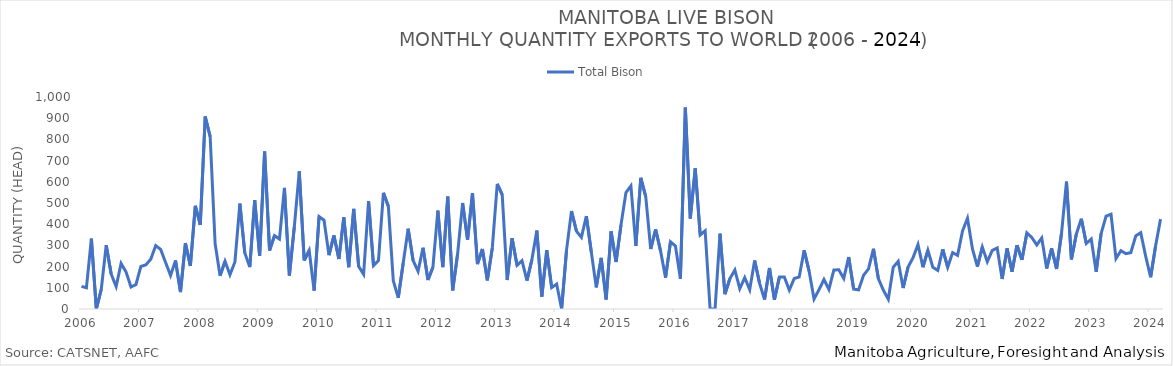
| Category | Total Bison |
|---|---|
| 2006-01-01 | 107 |
| 2006-02-01 | 100 |
| 2006-03-01 | 332 |
| 2006-04-01 | 0 |
| 2006-05-01 | 93 |
| 2006-06-01 | 301 |
| 2006-07-01 | 165 |
| 2006-08-01 | 106 |
| 2006-09-01 | 215 |
| 2006-10-01 | 175 |
| 2006-11-01 | 104 |
| 2006-12-01 | 115 |
| 2007-01-01 | 201 |
| 2007-02-01 | 208 |
| 2007-03-01 | 235 |
| 2007-04-01 | 299 |
| 2007-05-01 | 281 |
| 2007-06-01 | 219 |
| 2007-07-01 | 158 |
| 2007-08-01 | 229 |
| 2007-09-01 | 80 |
| 2007-10-01 | 311 |
| 2007-11-01 | 203 |
| 2007-12-01 | 487 |
| 2008-01-01 | 397 |
| 2008-02-01 | 908 |
| 2008-03-01 | 813 |
| 2008-04-01 | 308 |
| 2008-05-01 | 157 |
| 2008-06-01 | 225 |
| 2008-07-01 | 162 |
| 2008-08-01 | 222 |
| 2008-09-01 | 497 |
| 2008-10-01 | 264 |
| 2008-11-01 | 198 |
| 2008-12-01 | 513 |
| 2009-01-01 | 251 |
| 2009-02-01 | 743 |
| 2009-03-01 | 276 |
| 2009-04-01 | 346 |
| 2009-05-01 | 330 |
| 2009-06-01 | 571 |
| 2009-07-01 | 158 |
| 2009-08-01 | 387 |
| 2009-09-01 | 649 |
| 2009-10-01 | 229 |
| 2009-11-01 | 276 |
| 2009-12-01 | 87 |
| 2010-01-01 | 436 |
| 2010-02-01 | 419 |
| 2010-03-01 | 254 |
| 2010-04-01 | 347 |
| 2010-05-01 | 236 |
| 2010-06-01 | 432 |
| 2010-07-01 | 197 |
| 2010-08-01 | 472 |
| 2010-09-01 | 201 |
| 2010-10-01 | 164 |
| 2010-11-01 | 509 |
| 2010-12-01 | 205 |
| 2011-01-01 | 228 |
| 2011-02-01 | 548 |
| 2011-03-01 | 484 |
| 2011-04-01 | 133 |
| 2011-05-01 | 53 |
| 2011-06-01 | 217 |
| 2011-07-01 | 379 |
| 2011-08-01 | 229 |
| 2011-09-01 | 178 |
| 2011-10-01 | 289 |
| 2011-11-01 | 137 |
| 2011-12-01 | 197 |
| 2012-01-01 | 464 |
| 2012-02-01 | 198 |
| 2012-03-01 | 530 |
| 2012-04-01 | 88 |
| 2012-05-01 | 262 |
| 2012-06-01 | 500 |
| 2012-07-01 | 326 |
| 2012-08-01 | 546 |
| 2012-09-01 | 212 |
| 2012-10-01 | 283 |
| 2012-11-01 | 135 |
| 2012-12-01 | 288 |
| 2013-01-01 | 590 |
| 2013-02-01 | 539 |
| 2013-03-01 | 137 |
| 2013-04-01 | 334 |
| 2013-05-01 | 206 |
| 2013-06-01 | 228 |
| 2013-07-01 | 134 |
| 2013-08-01 | 233 |
| 2013-09-01 | 370 |
| 2013-10-01 | 58 |
| 2013-11-01 | 277 |
| 2013-12-01 | 101 |
| 2014-01-01 | 118 |
| 2014-02-01 | 0 |
| 2014-03-01 | 279 |
| 2014-04-01 | 462 |
| 2014-05-01 | 367 |
| 2014-06-01 | 338 |
| 2014-07-01 | 438 |
| 2014-08-01 | 269 |
| 2014-09-01 | 102 |
| 2014-10-01 | 241 |
| 2014-11-01 | 45 |
| 2014-12-01 | 366 |
| 2015-01-01 | 222 |
| 2015-02-01 | 397 |
| 2015-03-01 | 549 |
| 2015-04-01 | 581 |
| 2015-05-01 | 298 |
| 2015-06-01 | 619 |
| 2015-07-01 | 530 |
| 2015-08-01 | 283 |
| 2015-09-01 | 375 |
| 2015-10-01 | 273 |
| 2015-11-01 | 148 |
| 2015-12-01 | 317 |
| 2016-01-01 | 297 |
| 2016-02-01 | 143 |
| 2016-03-01 | 950 |
| 2016-04-01 | 427 |
| 2016-05-01 | 663 |
| 2016-06-01 | 349 |
| 2016-07-01 | 369 |
| 2016-08-01 | 0 |
| 2016-09-01 | 0 |
| 2016-10-01 | 355 |
| 2016-11-01 | 70 |
| 2016-12-01 | 143 |
| 2017-01-01 | 184 |
| 2017-02-01 | 96 |
| 2017-03-01 | 148 |
| 2017-04-01 | 91 |
| 2017-05-01 | 229 |
| 2017-06-01 | 121 |
| 2017-07-01 | 45 |
| 2017-08-01 | 193 |
| 2017-09-01 | 44 |
| 2017-10-01 | 151 |
| 2017-11-01 | 151 |
| 2017-12-01 | 89 |
| 2018-01-01 | 144 |
| 2018-02-01 | 151 |
| 2018-03-01 | 277 |
| 2018-04-01 | 179 |
| 2018-05-01 | 47 |
| 2018-06-01 | 91 |
| 2018-07-01 | 139 |
| 2018-08-01 | 92 |
| 2018-09-01 | 184 |
| 2018-10-01 | 185 |
| 2018-11-01 | 144 |
| 2018-12-01 | 245 |
| 2019-01-01 | 94 |
| 2019-02-01 | 90 |
| 2019-03-01 | 159 |
| 2019-04-01 | 189 |
| 2019-05-01 | 284 |
| 2019-06-01 | 143 |
| 2019-07-01 | 89 |
| 2019-08-01 | 46 |
| 2019-09-01 | 197 |
| 2019-10-01 | 225 |
| 2019-11-01 | 99 |
| 2019-12-01 | 198 |
| 2020-01-01 | 242 |
| 2020-02-01 | 304 |
| 2020-03-01 | 197 |
| 2020-04-01 | 277 |
| 2020-05-01 | 197 |
| 2020-06-01 | 182 |
| 2020-07-01 | 282 |
| 2020-08-01 | 197 |
| 2020-09-01 | 266 |
| 2020-10-01 | 253 |
| 2020-11-01 | 368 |
| 2020-12-01 | 428 |
| 2021-01-01 | 284 |
| 2021-02-01 | 200 |
| 2021-03-01 | 292 |
| 2021-04-01 | 223 |
| 2021-05-01 | 276 |
| 2021-06-01 | 288 |
| 2021-07-01 | 142 |
| 2021-08-01 | 286 |
| 2021-09-01 | 176 |
| 2021-10-01 | 301 |
| 2021-11-01 | 232 |
| 2021-12-01 | 359 |
| 2022-01-01 | 337 |
| 2022-02-01 | 302 |
| 2022-03-01 | 335 |
| 2022-04-01 | 191 |
| 2022-05-01 | 286 |
| 2022-06-01 | 189 |
| 2022-07-01 | 357 |
| 2022-08-01 | 601 |
| 2022-09-01 | 234 |
| 2022-10-01 | 354 |
| 2022-11-01 | 426 |
| 2022-12-01 | 309 |
| 2023-01-01 | 330 |
| 2023-02-01 | 176 |
| 2023-03-01 | 356 |
| 2023-04-01 | 438 |
| 2023-05-01 | 447 |
| 2023-06-01 | 238 |
| 2023-07-01 | 275 |
| 2023-08-01 | 261 |
| 2023-09-01 | 266 |
| 2023-10-01 | 345 |
| 2023-11-01 | 360 |
| 2023-12-01 | 249 |
| 2024-01-01 | 150 |
| 2024-02-01 | 297 |
| 2024-03-01 | 424 |